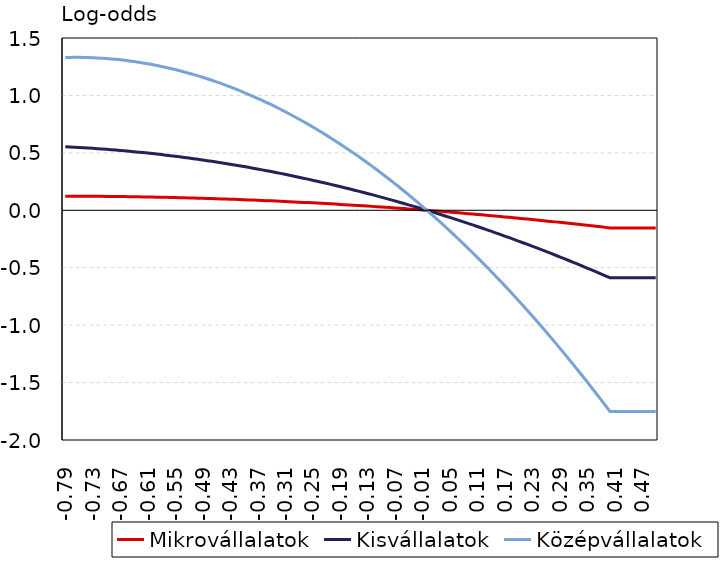
| Category | Mikrovállalatok | Kisvállalatok | Középvállalatok |
|---|---|---|---|
| -0.79 | 0.123 | 0.553 | 1.33 |
| -0.78 | 0.123 | 0.551 | 1.331 |
| -0.77 | 0.123 | 0.549 | 1.332 |
| -0.76 | 0.122 | 0.547 | 1.331 |
| -0.75 | 0.122 | 0.545 | 1.331 |
| -0.74 | 0.122 | 0.542 | 1.33 |
| -0.73 | 0.122 | 0.54 | 1.328 |
| -0.72 | 0.121 | 0.537 | 1.327 |
| -0.71 | 0.121 | 0.534 | 1.324 |
| -0.7 | 0.121 | 0.531 | 1.321 |
| -0.69 | 0.12 | 0.528 | 1.318 |
| -0.68 | 0.12 | 0.525 | 1.315 |
| -0.67 | 0.119 | 0.521 | 1.31 |
| -0.66 | 0.119 | 0.518 | 1.306 |
| -0.65 | 0.118 | 0.514 | 1.301 |
| -0.64 | 0.118 | 0.51 | 1.295 |
| -0.63 | 0.117 | 0.506 | 1.289 |
| -0.62 | 0.117 | 0.502 | 1.283 |
| -0.61 | 0.116 | 0.498 | 1.276 |
| -0.6 | 0.115 | 0.494 | 1.269 |
| -0.59 | 0.114 | 0.489 | 1.261 |
| -0.58 | 0.113 | 0.485 | 1.253 |
| -0.57 | 0.113 | 0.48 | 1.244 |
| -0.56 | 0.112 | 0.475 | 1.235 |
| -0.55 | 0.111 | 0.47 | 1.225 |
| -0.54 | 0.11 | 0.465 | 1.215 |
| -0.53 | 0.109 | 0.46 | 1.205 |
| -0.52 | 0.108 | 0.455 | 1.194 |
| -0.51 | 0.107 | 0.449 | 1.182 |
| -0.5 | 0.105 | 0.444 | 1.17 |
| -0.49 | 0.104 | 0.438 | 1.158 |
| -0.48 | 0.103 | 0.432 | 1.145 |
| -0.47 | 0.102 | 0.426 | 1.132 |
| -0.46 | 0.101 | 0.42 | 1.118 |
| -0.45 | 0.099 | 0.414 | 1.104 |
| -0.44 | 0.098 | 0.408 | 1.09 |
| -0.429999999999999 | 0.096 | 0.401 | 1.075 |
| -0.419999999999999 | 0.095 | 0.394 | 1.059 |
| -0.409999999999999 | 0.094 | 0.388 | 1.043 |
| -0.399999999999999 | 0.092 | 0.381 | 1.027 |
| -0.389999999999999 | 0.09 | 0.374 | 1.01 |
| -0.379999999999999 | 0.089 | 0.367 | 0.993 |
| -0.369999999999999 | 0.087 | 0.359 | 0.975 |
| -0.359999999999999 | 0.086 | 0.352 | 0.957 |
| -0.349999999999999 | 0.084 | 0.345 | 0.938 |
| -0.339999999999999 | 0.082 | 0.337 | 0.919 |
| -0.329999999999999 | 0.08 | 0.329 | 0.9 |
| -0.319999999999999 | 0.079 | 0.321 | 0.88 |
| -0.309999999999999 | 0.077 | 0.313 | 0.859 |
| -0.299999999999999 | 0.075 | 0.305 | 0.838 |
| -0.289999999999999 | 0.073 | 0.297 | 0.817 |
| -0.279999999999999 | 0.071 | 0.288 | 0.795 |
| -0.269999999999999 | 0.069 | 0.28 | 0.773 |
| -0.259999999999999 | 0.067 | 0.271 | 0.75 |
| -0.249999999999999 | 0.065 | 0.262 | 0.727 |
| -0.239999999999999 | 0.063 | 0.253 | 0.703 |
| -0.229999999999999 | 0.06 | 0.244 | 0.679 |
| -0.219999999999999 | 0.058 | 0.235 | 0.655 |
| -0.209999999999999 | 0.056 | 0.226 | 0.63 |
| -0.199999999999999 | 0.054 | 0.216 | 0.604 |
| -0.189999999999999 | 0.051 | 0.207 | 0.578 |
| -0.179999999999999 | 0.049 | 0.197 | 0.552 |
| -0.169999999999999 | 0.047 | 0.187 | 0.525 |
| -0.159999999999999 | 0.044 | 0.177 | 0.498 |
| -0.149999999999999 | 0.042 | 0.167 | 0.47 |
| -0.139999999999999 | 0.039 | 0.157 | 0.442 |
| -0.129999999999999 | 0.037 | 0.146 | 0.413 |
| -0.119999999999999 | 0.034 | 0.136 | 0.384 |
| -0.109999999999999 | 0.031 | 0.125 | 0.355 |
| -0.099999999999999 | 0.029 | 0.115 | 0.325 |
| -0.089999999999999 | 0.026 | 0.104 | 0.294 |
| -0.079999999999999 | 0.023 | 0.093 | 0.263 |
| -0.069999999999999 | 0.021 | 0.082 | 0.232 |
| -0.0599999999999991 | 0.018 | 0.07 | 0.2 |
| -0.049999999999999 | 0.015 | 0.059 | 0.168 |
| -0.039999999999999 | 0.012 | 0.047 | 0.135 |
| -0.029999999999999 | 0.009 | 0.036 | 0.102 |
| -0.019999999999999 | 0.006 | 0.024 | 0.069 |
| -0.00999999999999901 | 0.003 | 0.012 | 0.035 |
| 0.0 | 0 | 0 | 0 |
| 0.01 | -0.003 | -0.012 | -0.035 |
| 0.02 | -0.006 | -0.024 | -0.07 |
| 0.03 | -0.009 | -0.037 | -0.106 |
| 0.04 | -0.013 | -0.049 | -0.143 |
| 0.05 | -0.016 | -0.062 | -0.179 |
| 0.0600000000000001 | -0.019 | -0.075 | -0.217 |
| 0.0700000000000001 | -0.022 | -0.088 | -0.254 |
| 0.0800000000000001 | -0.026 | -0.101 | -0.292 |
| 0.0900000000000001 | -0.029 | -0.114 | -0.331 |
| 0.1 | -0.033 | -0.127 | -0.37 |
| 0.11 | -0.036 | -0.141 | -0.409 |
| 0.12 | -0.04 | -0.155 | -0.449 |
| 0.13 | -0.043 | -0.168 | -0.49 |
| 0.14 | -0.047 | -0.182 | -0.531 |
| 0.15 | -0.05 | -0.196 | -0.572 |
| 0.16 | -0.054 | -0.21 | -0.614 |
| 0.17 | -0.058 | -0.224 | -0.656 |
| 0.18 | -0.061 | -0.239 | -0.699 |
| 0.19 | -0.065 | -0.253 | -0.742 |
| 0.2 | -0.069 | -0.268 | -0.785 |
| 0.21 | -0.073 | -0.283 | -0.829 |
| 0.22 | -0.077 | -0.297 | -0.874 |
| 0.23 | -0.081 | -0.312 | -0.919 |
| 0.24 | -0.085 | -0.328 | -0.964 |
| 0.25 | -0.089 | -0.343 | -1.01 |
| 0.26 | -0.093 | -0.358 | -1.056 |
| 0.27 | -0.097 | -0.374 | -1.103 |
| 0.28 | -0.101 | -0.389 | -1.15 |
| 0.29 | -0.105 | -0.405 | -1.198 |
| 0.3 | -0.109 | -0.421 | -1.246 |
| 0.31 | -0.114 | -0.437 | -1.294 |
| 0.32 | -0.118 | -0.453 | -1.343 |
| 0.33 | -0.122 | -0.47 | -1.393 |
| 0.34 | -0.126 | -0.486 | -1.443 |
| 0.35 | -0.131 | -0.503 | -1.493 |
| 0.36 | -0.135 | -0.519 | -1.544 |
| 0.37 | -0.14 | -0.536 | -1.595 |
| 0.38 | -0.144 | -0.553 | -1.647 |
| 0.39 | -0.149 | -0.57 | -1.699 |
| 0.4 | -0.153 | -0.587 | -1.752 |
| 0.41 | -0.153 | -0.587 | -1.752 |
| 0.42 | -0.153 | -0.587 | -1.752 |
| 0.43 | -0.153 | -0.587 | -1.752 |
| 0.44 | -0.153 | -0.587 | -1.752 |
| 0.45 | -0.153 | -0.587 | -1.752 |
| 0.46 | -0.153 | -0.587 | -1.752 |
| 0.47 | -0.153 | -0.587 | -1.752 |
| 0.48 | -0.153 | -0.587 | -1.752 |
| 0.49 | -0.153 | -0.587 | -1.752 |
| 0.5 | -0.153 | -0.587 | -1.752 |